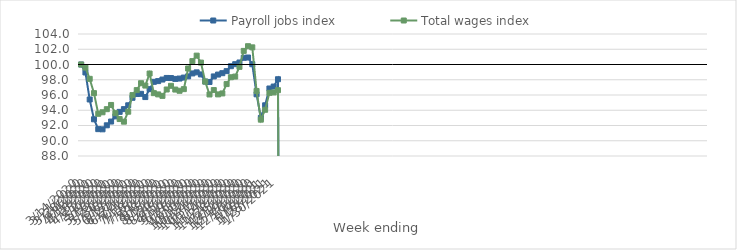
| Category | Payroll jobs index | Total wages index |
|---|---|---|
| 14/03/2020 | 100 | 100 |
| 21/03/2020 | 98.956 | 99.595 |
| 28/03/2020 | 95.413 | 98.12 |
| 04/04/2020 | 92.814 | 96.244 |
| 11/04/2020 | 91.522 | 93.536 |
| 18/04/2020 | 91.5 | 93.735 |
| 25/04/2020 | 92.025 | 94.14 |
| 02/05/2020 | 92.519 | 94.693 |
| 09/05/2020 | 93.198 | 93.616 |
| 16/05/2020 | 93.788 | 92.845 |
| 23/05/2020 | 94.146 | 92.504 |
| 30/05/2020 | 94.65 | 93.808 |
| 06/06/2020 | 95.634 | 95.987 |
| 13/06/2020 | 96.135 | 96.641 |
| 20/06/2020 | 96.154 | 97.544 |
| 27/06/2020 | 95.728 | 97.236 |
| 04/07/2020 | 96.767 | 98.815 |
| 11/07/2020 | 97.729 | 96.243 |
| 18/07/2020 | 97.82 | 96.079 |
| 25/07/2020 | 98.028 | 95.887 |
| 01/08/2020 | 98.238 | 96.723 |
| 08/08/2020 | 98.223 | 97.204 |
| 15/08/2020 | 98.112 | 96.712 |
| 22/08/2020 | 98.158 | 96.554 |
| 29/08/2020 | 98.287 | 96.77 |
| 05/09/2020 | 98.443 | 99.477 |
| 12/09/2020 | 98.829 | 100.444 |
| 19/09/2020 | 98.97 | 101.162 |
| 26/09/2020 | 98.7 | 100.248 |
| 03/10/2020 | 97.765 | 97.757 |
| 10/10/2020 | 97.711 | 96.071 |
| 17/10/2020 | 98.435 | 96.645 |
| 24/10/2020 | 98.68 | 96.08 |
| 31/10/2020 | 98.863 | 96.206 |
| 07/11/2020 | 99.129 | 97.432 |
| 14/11/2020 | 99.776 | 98.33 |
| 21/11/2020 | 100.039 | 98.416 |
| 28/11/2020 | 100.264 | 99.694 |
| 05/12/2020 | 100.878 | 101.784 |
| 12/12/2020 | 100.916 | 102.402 |
| 19/12/2020 | 100.035 | 102.249 |
| 26/12/2020 | 96.089 | 96.528 |
| 02/01/2021 | 92.998 | 92.765 |
| 09/01/2021 | 94.651 | 94.062 |
| 16/01/2021 | 96.853 | 96.284 |
| 23/01/2021 | 97.109 | 96.336 |
| 30/01/2021 | 98.068 | 96.635 |